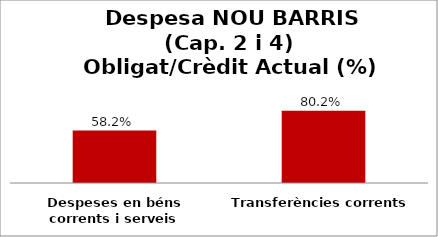
| Category | Series 0 |
|---|---|
| Despeses en béns corrents i serveis | 0.582 |
| Transferències corrents | 0.802 |